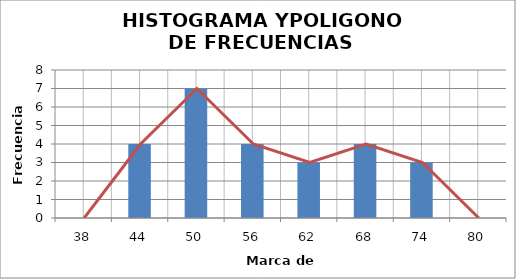
| Category | 0 4 7 4 3 4 3 0 |
|---|---|
| 38.0 | 0 |
| 44.0 | 4 |
| 50.0 | 7 |
| 56.0 | 4 |
| 62.0 | 3 |
| 68.0 | 4 |
| 74.0 | 3 |
| 80.0 | 0 |